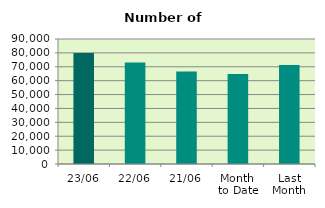
| Category | Series 0 |
|---|---|
| 23/06 | 79870 |
| 22/06 | 73146 |
| 21/06 | 66560 |
| Month 
to Date | 64838 |
| Last
Month | 71249.7 |